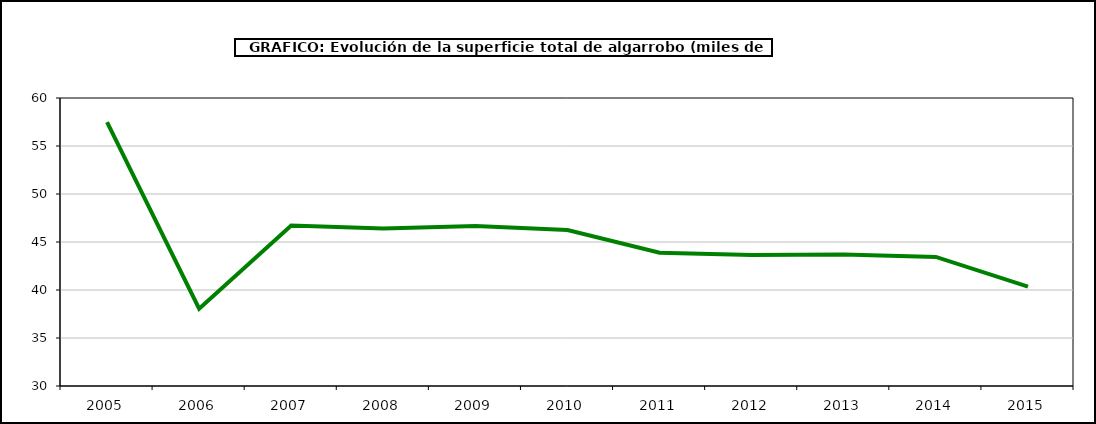
| Category | superficie |
|---|---|
| 2005.0 | 57.48 |
| 2006.0 | 38.058 |
| 2007.0 | 46.708 |
| 2008.0 | 46.404 |
| 2009.0 | 46.656 |
| 2010.0 | 46.243 |
| 2011.0 | 43.883 |
| 2012.0 | 43.647 |
| 2013.0 | 43.695 |
| 2014.0 | 43.447 |
| 2015.0 | 40.353 |